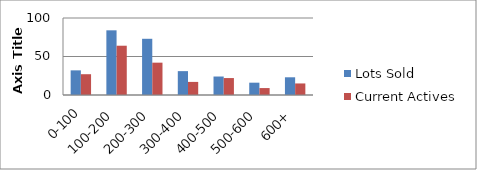
| Category | Lots Sold | Current Actives |
|---|---|---|
| 0-100 | 32 | 27 |
| 100-200 | 84 | 64 |
| 200-300 | 73 | 42 |
| 300-400 | 31 | 17 |
| 400-500 | 24 | 22 |
| 500-600 | 16 | 9 |
| 600+ | 23 | 15 |